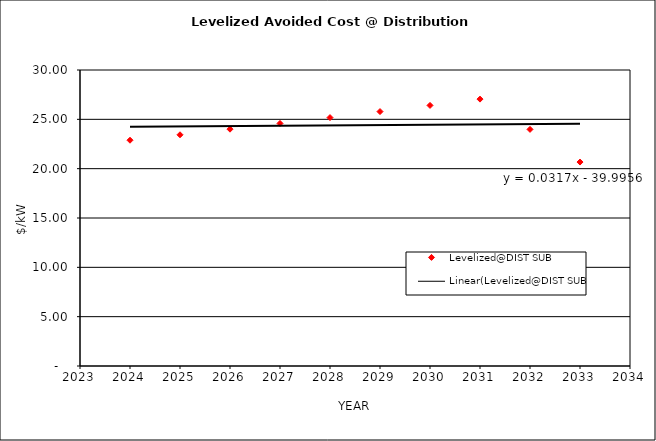
| Category | Levelized@DIST SUB |
|---|---|
| 2024.0 | 22.882 |
| 2025.0 | 23.436 |
| 2026.0 | 24.002 |
| 2027.0 | 24.583 |
| 2028.0 | 25.178 |
| 2029.0 | 25.787 |
| 2030.0 | 26.41 |
| 2031.0 | 27.049 |
| 2032.0 | 23.981 |
| 2033.0 | 20.671 |